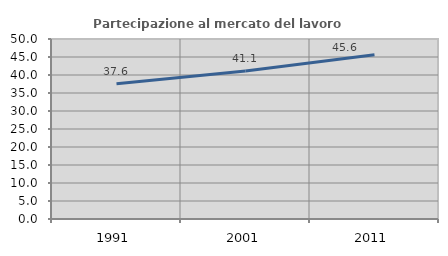
| Category | Partecipazione al mercato del lavoro  femminile |
|---|---|
| 1991.0 | 37.59 |
| 2001.0 | 41.096 |
| 2011.0 | 45.616 |